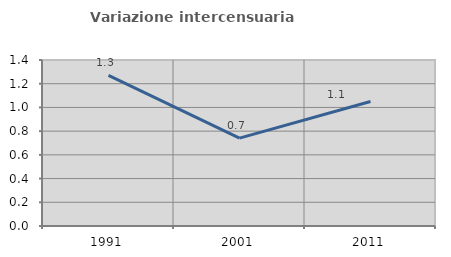
| Category | Variazione intercensuaria annua |
|---|---|
| 1991.0 | 1.27 |
| 2001.0 | 0.741 |
| 2011.0 | 1.05 |